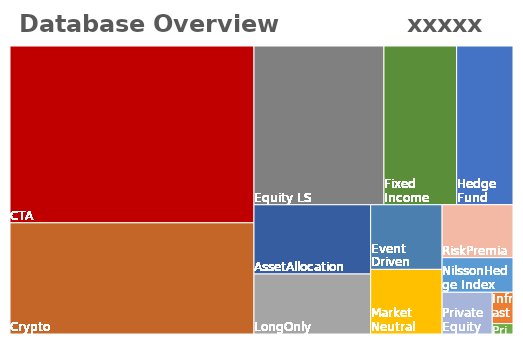
| Category | Avg MTD |
|---|---|
| AssetAllocation | 0.02 |
| Crypto | 0.175 |
| CTA | 0.024 |
| Equity LS | 0.024 |
| Event Driven | 0.014 |
| Fixed Income | 0.01 |
| Hedge Fund | 0.017 |
| Infrastructure | 0.015 |
| LongOnly | 0.028 |
| Market Neutral | 0.01 |
| NilssonHedge Index | 0.025 |
| Private Debt | 0 |
| Private Equity | -0.004 |
| RiskPremia | 0.02 |